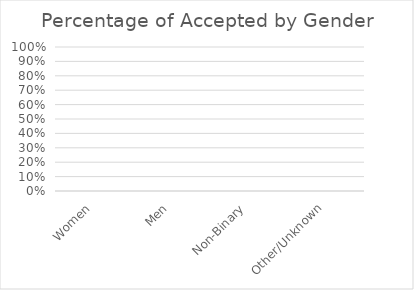
| Category | % of accepted |
|---|---|
| Women | 0 |
| Men | 0 |
| Non-Binary | 0 |
| Other/Unknown | 0 |